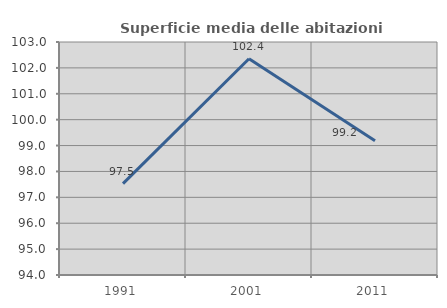
| Category | Superficie media delle abitazioni occupate |
|---|---|
| 1991.0 | 97.528 |
| 2001.0 | 102.354 |
| 2011.0 | 99.183 |